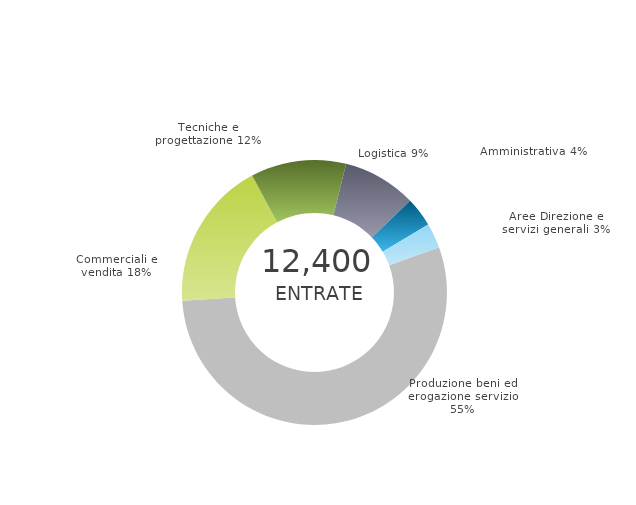
| Category | Series 0 | Series 1 |
|---|---|---|
| Produzione beni ed erogazione servizio | 0 | 0.546 |
| Commerciali e vendita | 0 | 0.182 |
| Tecniche e progettazione | 0 | 0.116 |
| Logistica | 0 | 0.09 |
| Amministrativa | 0 | 0.036 |
| Aree Direzione e servizi generali | 0 | 0.03 |